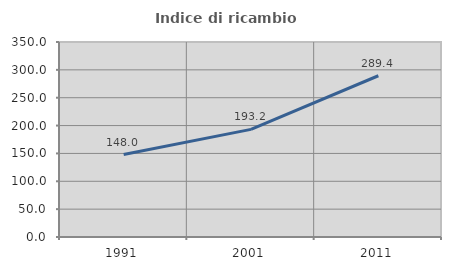
| Category | Indice di ricambio occupazionale  |
|---|---|
| 1991.0 | 147.951 |
| 2001.0 | 193.176 |
| 2011.0 | 289.411 |